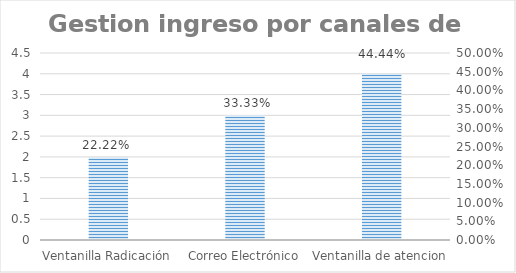
| Category | Series 0 |
|---|---|
| Ventanilla Radicación | 2 |
| Correo Electrónico | 3 |
| Ventanilla de atencion | 4 |